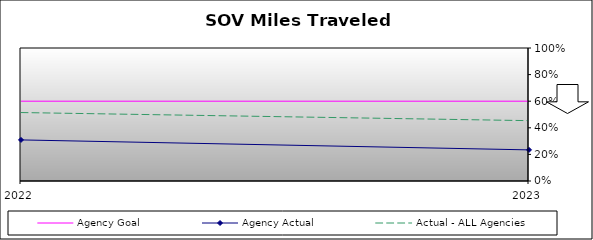
| Category | Agency Goal | Agency Actual | Actual - ALL Agencies |
|---|---|---|---|
| 2022.0 | 0.6 | 0.309 | 0.515 |
| 2023.0 | 0.6 | 0.234 | 0.454 |